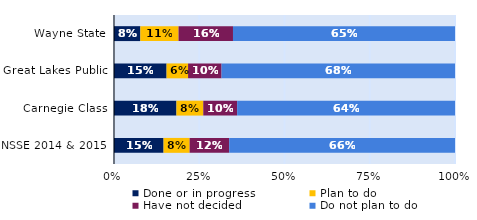
| Category | Done or in progress | Plan to do | Have not decided | Do not plan to do |
|---|---|---|---|---|
| Wayne State | 0.077 | 0.112 | 0.16 | 0.651 |
| Great Lakes Public | 0.154 | 0.063 | 0.098 | 0.685 |
| Carnegie Class | 0.183 | 0.079 | 0.099 | 0.639 |
| NSSE 2014 & 2015 | 0.145 | 0.077 | 0.116 | 0.662 |